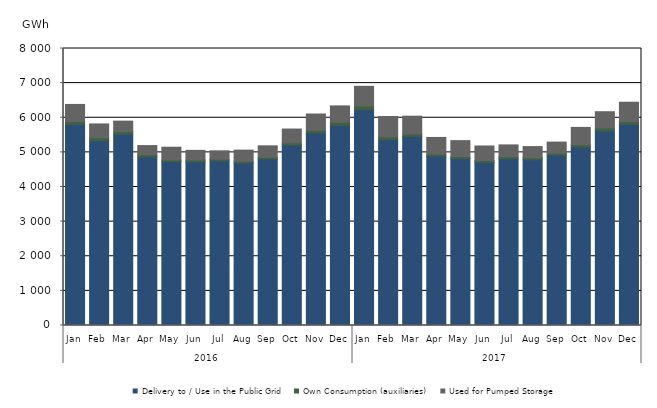
| Category | Delivery to / Use in the Public Grid | Own Consumption (auxiliaries) | Used for Pumped Storage |
|---|---|---|---|
| 0 | 5808310.514 | 84277.172 | 492318.888 |
| 1 | 5339722.112 | 84446.527 | 397290.273 |
| 2 | 5526798.082 | 78829.284 | 296709.721 |
| 3 | 4872122.27 | 59240.266 | 264873.388 |
| 4 | 4734078.535 | 46439.88 | 369042.22 |
| 5 | 4727342.416 | 51444.528 | 279823.149 |
| 6 | 4754278.557 | 49913.695 | 241031.223 |
| 7 | 4692147.718 | 49121.454 | 323884.738 |
| 8 | 4810636.208 | 46666.967 | 332188.853 |
| 9 | 5207614.876 | 69532.222 | 397190.296 |
| 10 | 5562418.251 | 74627.809 | 471075.508 |
| 11 | 5779484.128 | 89988.724 | 473360.921 |
| 12 | 6235136.537 | 106599.022 | 565598.779 |
| 13 | 5370223.219 | 79044.786 | 586961.062 |
| 14 | 5457132.095 | 72533.596 | 515344.442 |
| 15 | 4894009.45 | 53808.289 | 483279.229 |
| 16 | 4825730.04 | 52356.761 | 461249.359 |
| 17 | 4709771.948 | 53462.773 | 421851.034 |
| 18 | 4818602.037 | 56158.957 | 341065.299 |
| 19 | 4784528.159 | 60015.331 | 322978.131 |
| 20 | 4917333.212 | 59890.572 | 319939.298 |
| 21 | 5156709.787 | 64265.626 | 500296.535 |
| 22 | 5624242.788 | 81641.428 | 468695.918 |
| 23 | 5811530.557 | 78774.435 | 557836.323 |